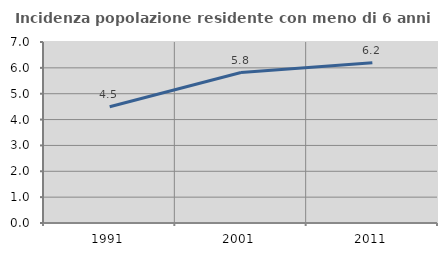
| Category | Incidenza popolazione residente con meno di 6 anni |
|---|---|
| 1991.0 | 4.498 |
| 2001.0 | 5.819 |
| 2011.0 | 6.197 |